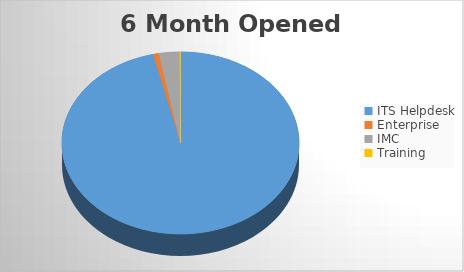
| Category | 6M Opened |
|---|---|
| ITS Helpdesk | 1973 |
| Enterprise | 15 |
| IMC | 58 |
| Training | 3 |